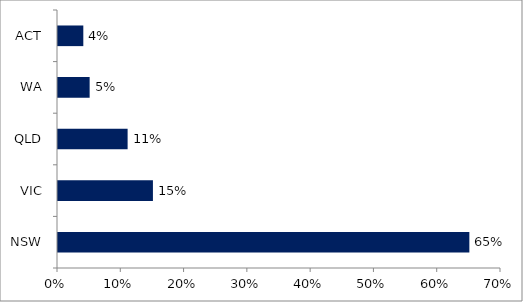
| Category | Series 0 |
|---|---|
| NSW | 0.65 |
| VIC | 0.15 |
| QLD | 0.11 |
| WA | 0.05 |
| ACT | 0.04 |